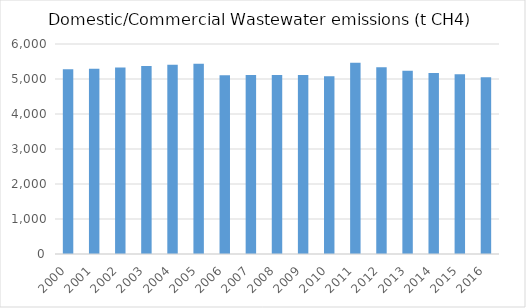
| Category | Series 0 |
|---|---|
| 2000.0 | 5281.362 |
| 2001.0 | 5295.283 |
| 2002.0 | 5332.01 |
| 2003.0 | 5370.583 |
| 2004.0 | 5404.182 |
| 2005.0 | 5436.087 |
| 2006.0 | 5106.881 |
| 2007.0 | 5114.297 |
| 2008.0 | 5115.596 |
| 2009.0 | 5111.993 |
| 2010.0 | 5075.444 |
| 2011.0 | 5464.87 |
| 2012.0 | 5334.653 |
| 2013.0 | 5238.641 |
| 2014.0 | 5173.67 |
| 2015.0 | 5133.832 |
| 2016.0 | 5049.867 |